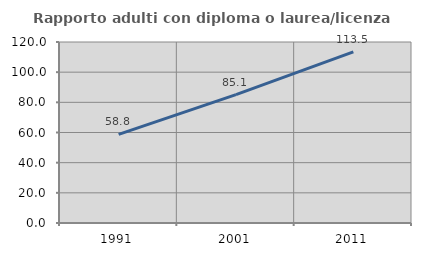
| Category | Rapporto adulti con diploma o laurea/licenza media  |
|---|---|
| 1991.0 | 58.794 |
| 2001.0 | 85.124 |
| 2011.0 | 113.455 |